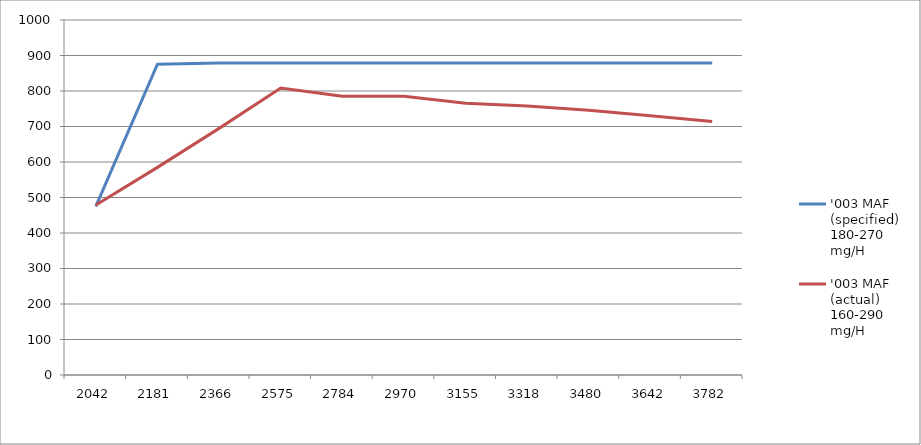
| Category | '003 MAF (specified) 180-270 mg/H | '003 MAF (actual) 160-290 mg/H |
|---|---|---|
| 2042.0 | 474.9 | 478.9 |
| 2181.0 | 875.3 | 584.8 |
| 2366.0 | 879.2 | 694.7 |
| 2575.0 | 879.2 | 808.6 |
| 2784.0 | 879.2 | 785 |
| 2970.0 | 879.2 | 785 |
| 3155.0 | 879.2 | 765.4 |
| 3318.0 | 879.2 | 757.5 |
| 3480.0 | 879.2 | 745.8 |
| 3642.0 | 879.2 | 730.1 |
| 3782.0 | 879.2 | 714.4 |